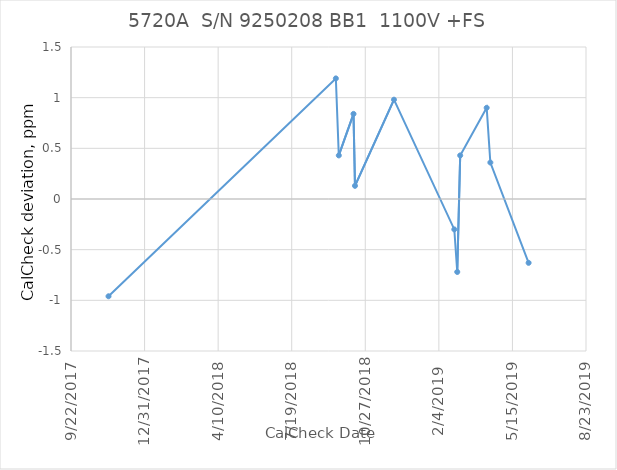
| Category |  1100V +FS |
|---|---|
| 43051.0 | -0.96 |
| 43360.0 | 1.19 |
| 43364.0 | 0.43 |
| 43384.0 | 0.84 |
| 43386.0 | 0.13 |
| 43439.0 | 0.98 |
| 43521.0 | -0.3 |
| 43525.0 | -0.72 |
| 43529.0 | 0.43 |
| 43565.0 | 0.9 |
| 43570.0 | 0.36 |
| 43622.0 | -0.63 |